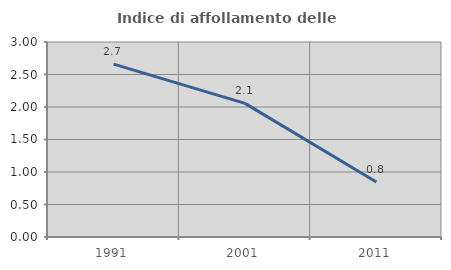
| Category | Indice di affollamento delle abitazioni  |
|---|---|
| 1991.0 | 2.66 |
| 2001.0 | 2.056 |
| 2011.0 | 0.847 |